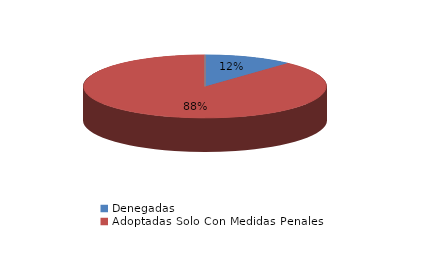
| Category | Series 0 |
|---|---|
| Denegadas | 2 |
| Adoptadas Solo Con Medidas Penales | 15 |
| Adoptadas Con Medidas Civiles Y Penales | 0 |
| Adoptadas Con Medidas Solo Civiles | 0 |